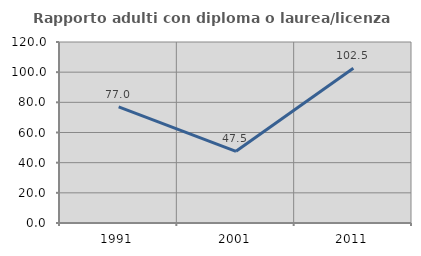
| Category | Rapporto adulti con diploma o laurea/licenza media  |
|---|---|
| 1991.0 | 76.977 |
| 2001.0 | 47.514 |
| 2011.0 | 102.544 |